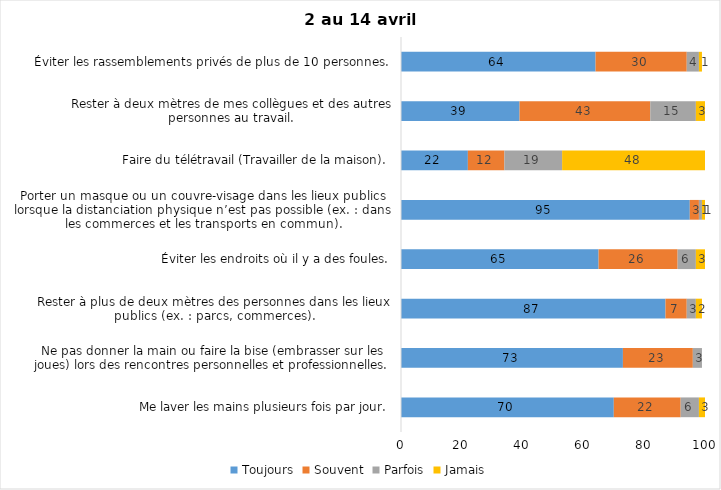
| Category | Toujours | Souvent | Parfois | Jamais |
|---|---|---|---|---|
| Me laver les mains plusieurs fois par jour. | 70 | 22 | 6 | 3 |
| Ne pas donner la main ou faire la bise (embrasser sur les joues) lors des rencontres personnelles et professionnelles. | 73 | 23 | 3 | 0 |
| Rester à plus de deux mètres des personnes dans les lieux publics (ex. : parcs, commerces). | 87 | 7 | 3 | 2 |
| Éviter les endroits où il y a des foules. | 65 | 26 | 6 | 3 |
| Porter un masque ou un couvre-visage dans les lieux publics lorsque la distanciation physique n’est pas possible (ex. : dans les commerces et les transports en commun). | 95 | 3 | 1 | 1 |
| Faire du télétravail (Travailler de la maison). | 22 | 12 | 19 | 48 |
| Rester à deux mètres de mes collègues et des autres personnes au travail. | 39 | 43 | 15 | 3 |
| Éviter les rassemblements privés de plus de 10 personnes. | 64 | 30 | 4 | 1 |